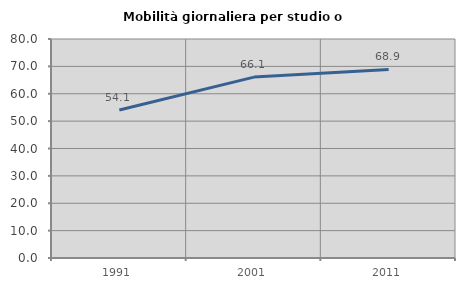
| Category | Mobilità giornaliera per studio o lavoro |
|---|---|
| 1991.0 | 54.09 |
| 2001.0 | 66.083 |
| 2011.0 | 68.859 |